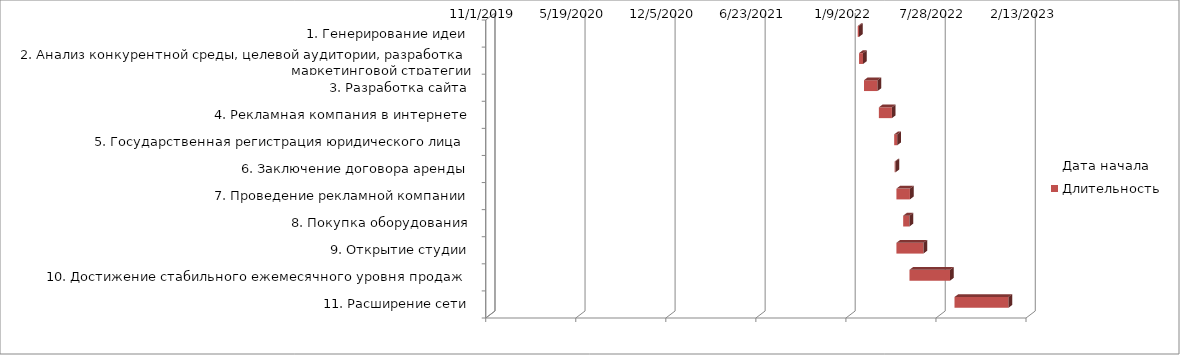
| Category | Дата начала | Длительность |
|---|---|---|
| 1. Генерирование идеи | 1/29/22 | 3 |
| 2. Анализ конкурентной среды, целевой аудитории, разработка маркетинговой стратегии | 2/1/22 | 9 |
| 3. Разработка сайта | 2/12/22 | 30 |
| 4. Рекламная компания в интернете | 3/17/22 | 29 |
| 5. Государственная регистрация юридического лица | 4/20/22 | 7 |
| 6. Заключение договора аренды | 4/21/22 | 2 |
| 7. Проведение рекламной компании | 4/25/22 | 30 |
| 8. Покупка оборудования | 5/10/22 | 14 |
| 9. Открытие студии | 4/25/22 | 60 |
| 10. Достижение стабильного ежемесячного уровня продаж | 5/24/22 | 90 |
| 11. Расширение сети | 9/1/22 | 120 |